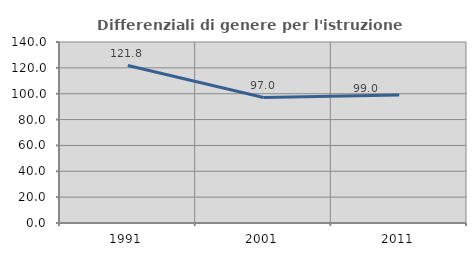
| Category | Differenziali di genere per l'istruzione superiore |
|---|---|
| 1991.0 | 121.803 |
| 2001.0 | 97.033 |
| 2011.0 | 98.959 |